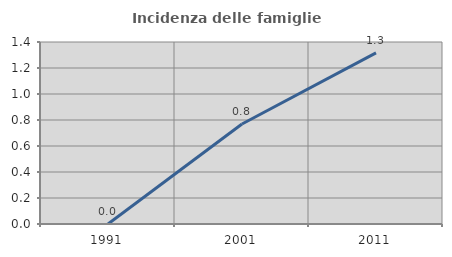
| Category | Incidenza delle famiglie numerose |
|---|---|
| 1991.0 | 0 |
| 2001.0 | 0.769 |
| 2011.0 | 1.316 |